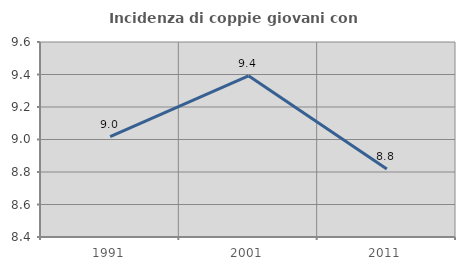
| Category | Incidenza di coppie giovani con figli |
|---|---|
| 1991.0 | 9.018 |
| 2001.0 | 9.392 |
| 2011.0 | 8.819 |